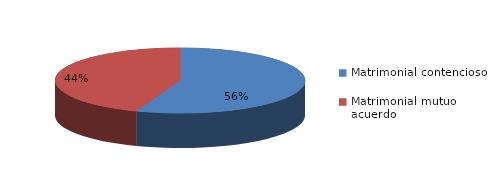
| Category | Series 0 |
|---|---|
| 0 | 636 |
| 1 | 507 |